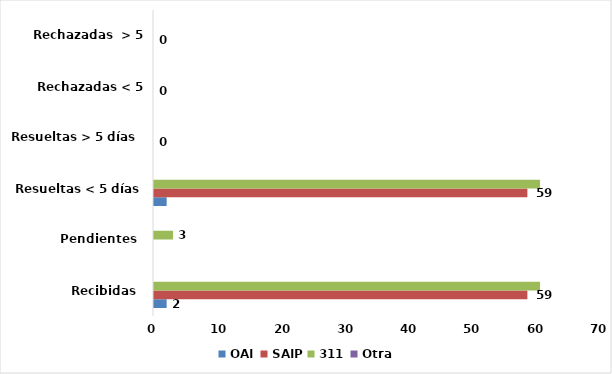
| Category | OAI | SAIP | 311 | Otra |
|---|---|---|---|---|
| Recibidas  | 2 | 59 | 61 | 0 |
| Pendientes  | 0 | 0 | 3 | 0 |
| Resueltas < 5 días | 2 | 59 | 61 | 0 |
| Resueltas > 5 días  | 0 | 0 | 0 | 0 |
| Rechazadas < 5 días  | 0 | 0 | 0 | 0 |
| Rechazadas  > 5 días | 0 | 0 | 0 | 0 |